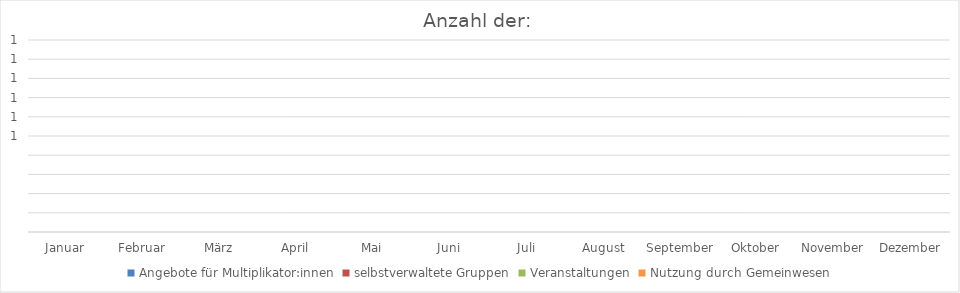
| Category | Angebote für Multiplikator:innen | selbstverwaltete Gruppen | Veranstaltungen | Nutzung durch Gemeinwesen |
|---|---|---|---|---|
| Januar | 0 | 0 | 0 | 0 |
| Februar | 0 | 0 | 0 | 0 |
| März | 0 | 0 | 0 | 0 |
| April | 0 | 0 | 0 | 0 |
| Mai | 0 | 0 | 0 | 0 |
| Juni | 0 | 0 | 0 | 0 |
| Juli | 0 | 0 | 0 | 0 |
| August | 0 | 0 | 0 | 0 |
| September | 0 | 0 | 0 | 0 |
| Oktober | 0 | 0 | 0 | 0 |
| November | 0 | 0 | 0 | 0 |
| Dezember | 0 | 0 | 0 | 0 |